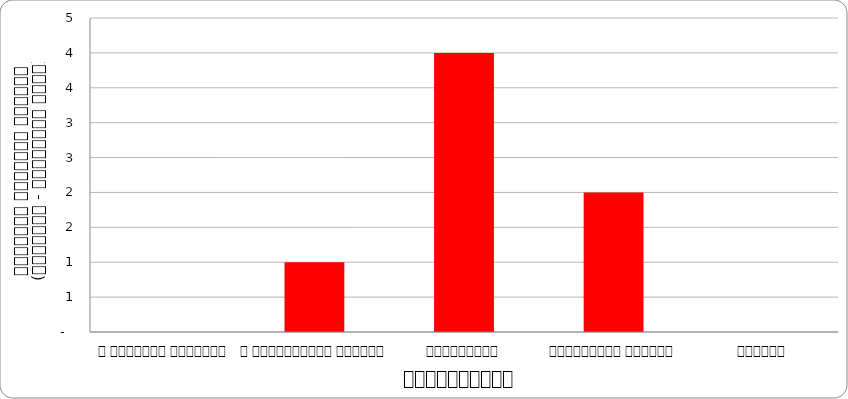
| Category | अर्थतन्त्र |
|---|---|
| द हिमालयन टाइम्स् | 0 |
| द काठमाण्डौं पोस्ट् | 1 |
| कान्तिपुर | 4 |
| अन्नपूर्ण पोस्ट् | 2 |
| नागरिक | 0 |